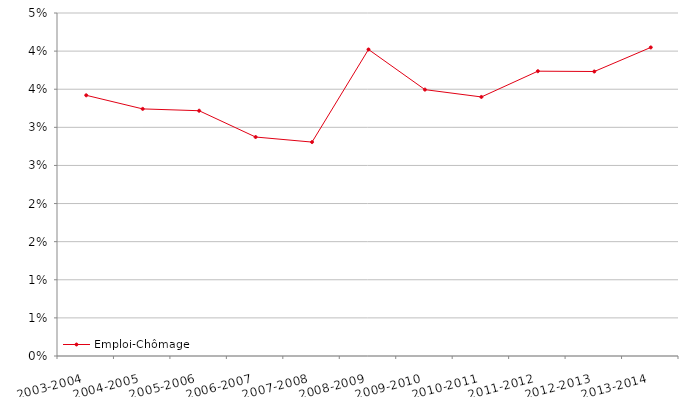
| Category | Emploi-Chômage |
|---|---|
| 2003-2004 | 0.034 |
| 2004-2005 | 0.032 |
| 2005-2006 | 0.032 |
| 2006-2007 | 0.029 |
| 2007-2008 | 0.028 |
| 2008-2009 | 0.04 |
| 2009-2010 | 0.035 |
| 2010-2011 | 0.034 |
| 2011-2012 | 0.037 |
| 2012-2013 | 0.037 |
| 2013-2014 | 0.04 |